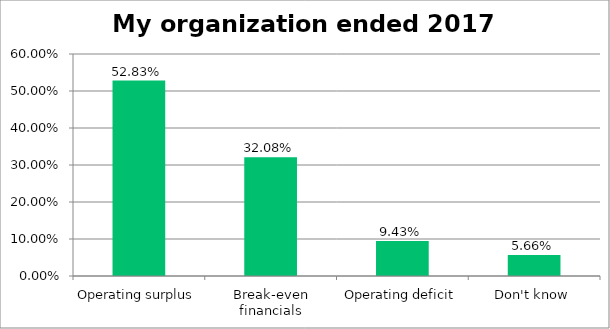
| Category | Responses |
|---|---|
| Operating surplus | 0.528 |
| Break-even financials | 0.321 |
| Operating deficit | 0.094 |
| Don't know | 0.057 |